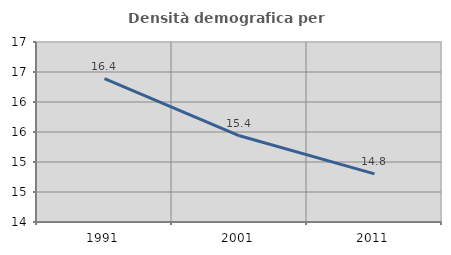
| Category | Densità demografica |
|---|---|
| 1991.0 | 16.388 |
| 2001.0 | 15.437 |
| 2011.0 | 14.802 |